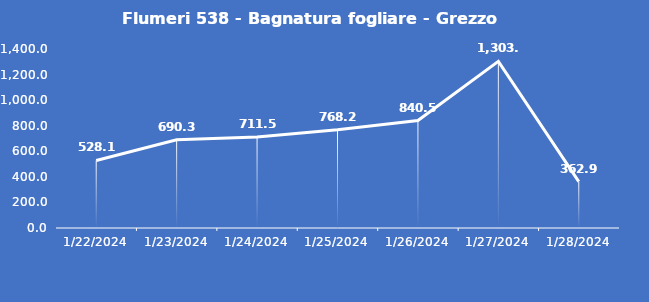
| Category | Flumeri 538 - Bagnatura fogliare - Grezzo (min) |
|---|---|
| 1/22/24 | 528.1 |
| 1/23/24 | 690.3 |
| 1/24/24 | 711.5 |
| 1/25/24 | 768.2 |
| 1/26/24 | 840.5 |
| 1/27/24 | 1303.2 |
| 1/28/24 | 362.9 |